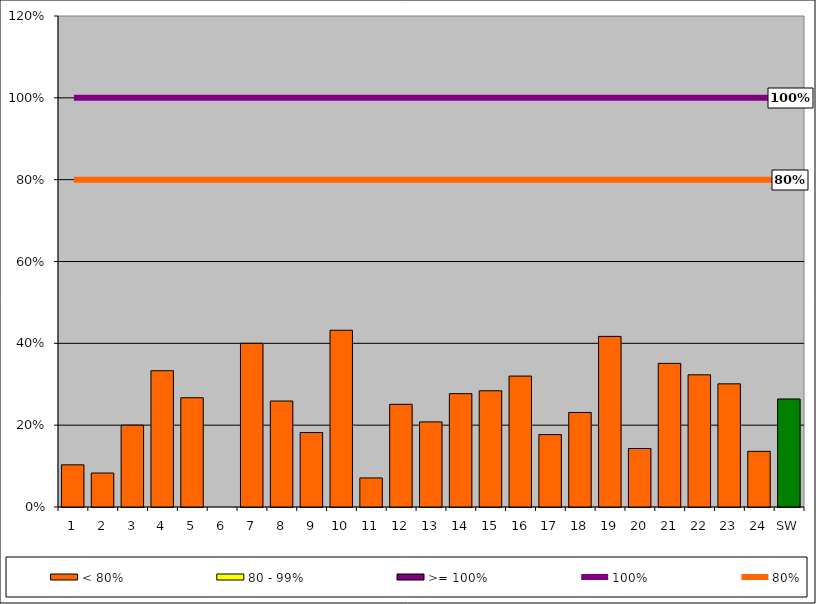
| Category | < 80% | 80 - 99% | >= 100% |
|---|---|---|---|
| 1 | 0.103 | 0 | 0 |
| 2 | 0.083 | 0 | 0 |
| 3 | 0.2 | 0 | 0 |
| 4 | 0.333 | 0 | 0 |
| 5 | 0.267 | 0 | 0 |
| 6 | 0 | 0 | 0 |
| 7 | 0.4 | 0 | 0 |
| 8 | 0.259 | 0 | 0 |
| 9 | 0.182 | 0 | 0 |
| 10 | 0.432 | 0 | 0 |
| 11 | 0.071 | 0 | 0 |
| 12 | 0.251 | 0 | 0 |
| 13 | 0.208 | 0 | 0 |
| 14 | 0.277 | 0 | 0 |
| 15 | 0.284 | 0 | 0 |
| 16 | 0.32 | 0 | 0 |
| 17 | 0.177 | 0 | 0 |
| 18 | 0.231 | 0 | 0 |
| 19 | 0.417 | 0 | 0 |
| 20 | 0.143 | 0 | 0 |
| 21 | 0.351 | 0 | 0 |
| 22 | 0.323 | 0 | 0 |
| 23 | 0.301 | 0 | 0 |
| 24 | 0.136 | 0 | 0 |
| SW | 0.264 | 0 | 0 |